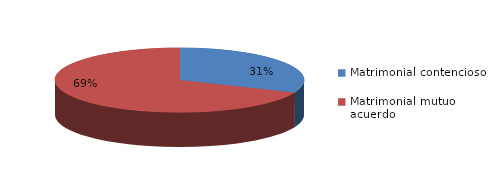
| Category | Series 0 |
|---|---|
| 0 | 134 |
| 1 | 293 |